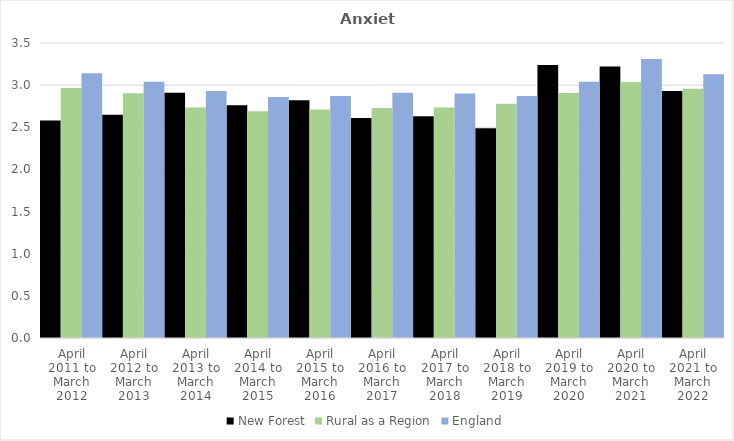
| Category | New Forest | Rural as a Region | England |
|---|---|---|---|
| April 2011 to March 2012 | 2.58 | 2.967 | 3.14 |
| April 2012 to March 2013 | 2.65 | 2.904 | 3.04 |
| April 2013 to March 2014 | 2.91 | 2.734 | 2.93 |
| April 2014 to March 2015 | 2.76 | 2.691 | 2.86 |
| April 2015 to March 2016 | 2.82 | 2.711 | 2.87 |
| April 2016 to March 2017 | 2.61 | 2.729 | 2.91 |
| April 2017 to March 2018 | 2.63 | 2.736 | 2.9 |
| April 2018 to March 2019 | 2.49 | 2.78 | 2.87 |
| April 2019 to March 2020 | 3.24 | 2.908 | 3.04 |
| April 2020 to March 2021 | 3.22 | 3.036 | 3.31 |
| April 2021 to March 2022 | 2.93 | 2.956 | 3.13 |